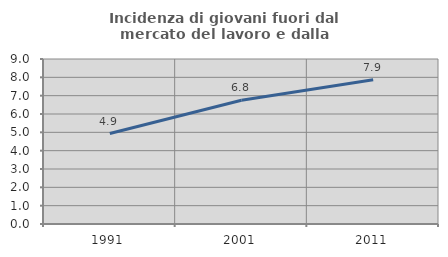
| Category | Incidenza di giovani fuori dal mercato del lavoro e dalla formazione  |
|---|---|
| 1991.0 | 4.934 |
| 2001.0 | 6.751 |
| 2011.0 | 7.862 |